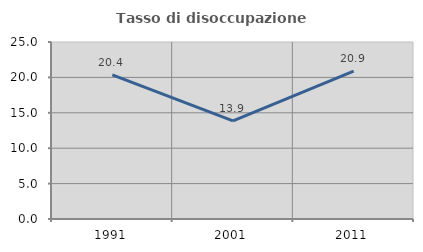
| Category | Tasso di disoccupazione giovanile  |
|---|---|
| 1991.0 | 20.37 |
| 2001.0 | 13.861 |
| 2011.0 | 20.896 |